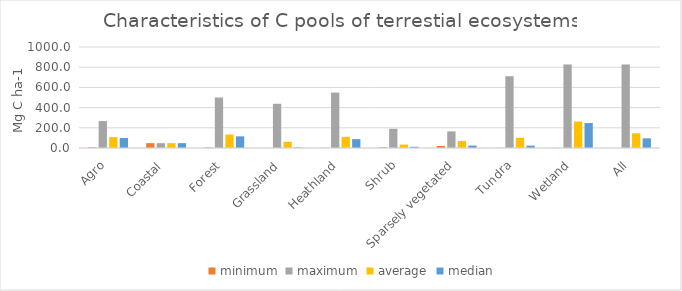
| Category | n | minimum | maximum | average | median |
|---|---|---|---|---|---|
| Agro |  | 7 | 266.667 | 107.722 | 99 |
| Coastal |  | 48 | 48 | 48 | 48 |
| Forest |  | 5 | 500 | 132.959 | 115.45 |
| Grassland |  | 0.5 | 438 | 61.297 | 5 |
| Heathland |  | 2 | 548.56 | 110.275 | 88 |
| Shrub |  | 6.91 | 190.14 | 33.457 | 11.95 |
| Sparsely vegetated |  | 20.55 | 164.5 | 69.683 | 24 |
| Tundra |  | 1.45 | 711 | 101.151 | 23.165 |
| Wetland |  | 0.9 | 827.125 | 261.784 | 247.188 |
| All |  | 0.5 | 827.125 | 145.702 | 96 |